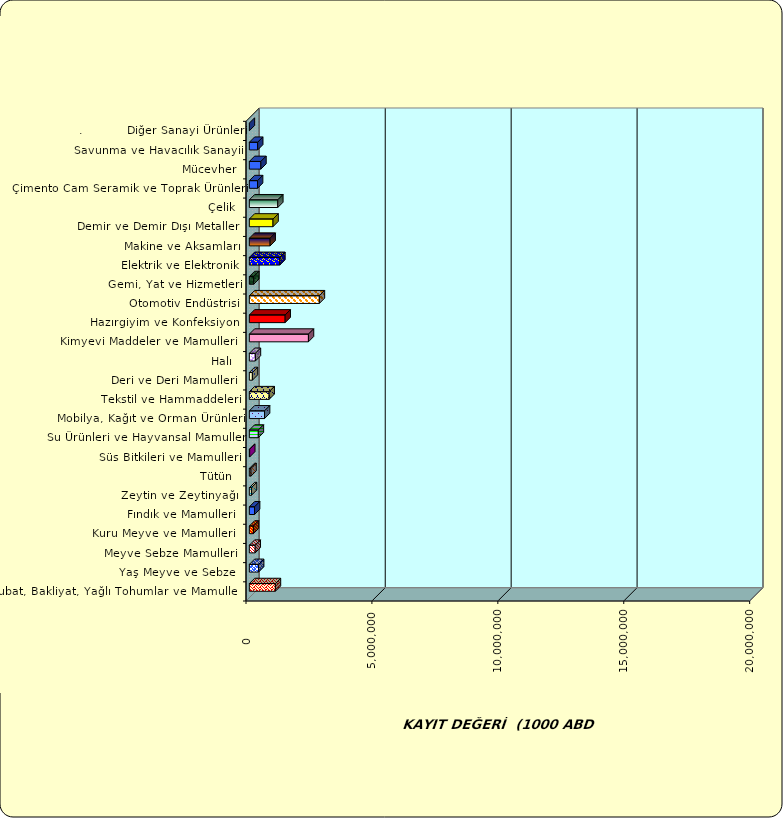
| Category | Series 0 |
|---|---|
|  Hububat, Bakliyat, Yağlı Tohumlar ve Mamulleri  | 1034455.022 |
|  Yaş Meyve ve Sebze   | 367112.916 |
|  Meyve Sebze Mamulleri  | 232816.469 |
|  Kuru Meyve ve Mamulleri   | 160915.732 |
|  Fındık ve Mamulleri  | 206553.327 |
|  Zeytin ve Zeytinyağı  | 83462.101 |
|  Tütün  | 64538.762 |
|  Süs Bitkileri ve Mamulleri | 13989.347 |
|  Su Ürünleri ve Hayvansal Mamuller | 356889.096 |
|  Mobilya, Kağıt ve Orman Ürünleri | 602945.487 |
|  Tekstil ve Hammaddeleri | 786365.411 |
|  Deri ve Deri Mamulleri  | 120774.981 |
|  Halı  | 239548.031 |
|  Kimyevi Maddeler ve Mamulleri   | 2346327.187 |
|  Hazırgiyim ve Konfeksiyon  | 1422027.133 |
|  Otomotiv Endüstrisi | 2779939.716 |
|  Gemi, Yat ve Hizmetleri | 174293.529 |
|  Elektrik ve Elektronik | 1210547.817 |
|  Makine ve Aksamları | 824451.202 |
|  Demir ve Demir Dışı Metaller  | 940168.366 |
|  Çelik | 1129357.931 |
|  Çimento Cam Seramik ve Toprak Ürünleri | 325328.927 |
|  Mücevher | 458489.262 |
|  Savunma ve Havacılık Sanayii | 330248.449 |
| .           Diğer Sanayi Ürünleri | 0 |